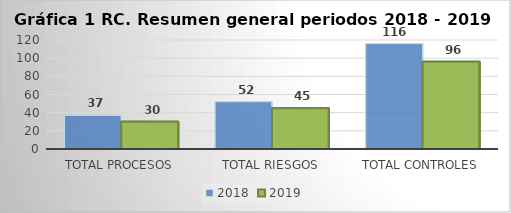
| Category | 2018 | 2019 |
|---|---|---|
| Total procesos | 37 | 30 |
| Total riesgos | 52 | 45 |
| Total controles | 116 | 96 |